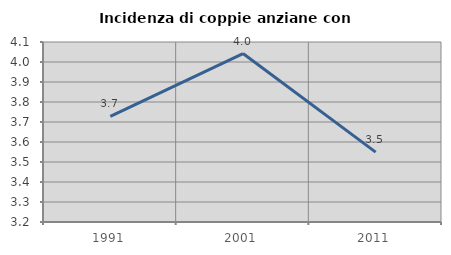
| Category | Incidenza di coppie anziane con figli |
|---|---|
| 1991.0 | 3.728 |
| 2001.0 | 4.042 |
| 2011.0 | 3.55 |